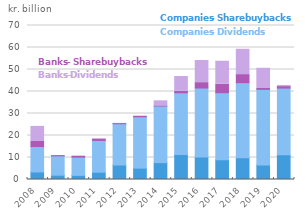
| Category | Companies Share buybacks | Companies Dividends | Banks Share buybacks | Banks Dividends |
|---|---|---|---|---|
| 2008.0 | 3.42 | 11.551 | 2.315 | 6.857 |
| 2009.0 | 1.962 | 8.78 | 0.105 | 0 |
| 2010.0 | 1.889 | 8.291 | 0.414 | 0 |
| 2011.0 | 3.312 | 14.435 | 0.621 | 0.184 |
| 2012.0 | 6.575 | 18.769 | 0.071 | 0.102 |
| 2013.0 | 5.161 | 23.35 | 0.194 | 0.13 |
| 2014.0 | 7.648 | 25.769 | 0.002 | 2.336 |
| 2015.0 | 11.348 | 28.063 | 0.687 | 6.731 |
| 2016.0 | 10.224 | 31.364 | 2.436 | 10.071 |
| 2017.0 | 8.94 | 30.503 | 3.807 | 10.516 |
| 2018.0 | 9.867 | 34.137 | 3.673 | 11.515 |
| 2019.0 | 6.627 | 34.362 | 0.38 | 9.191 |
| 2020.0 | 11.196 | 30.359 | 0.676 | 0.516 |